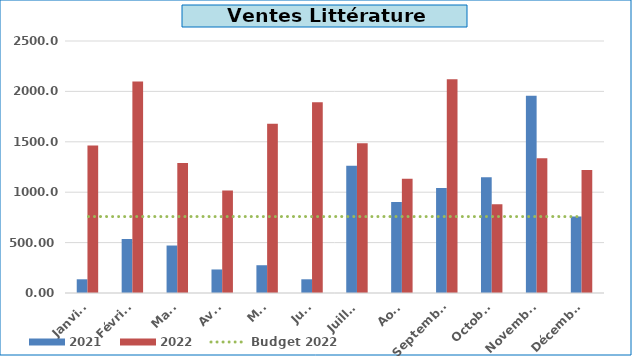
| Category | 2021 | 2022 |
|---|---|---|
| Janvier | 136 | 1463.5 |
| Février | 536 | 2097.5 |
| Mars | 471 | 1289.9 |
| Avril | 233.5 | 1018.1 |
| Mai | 275.5 | 1678.4 |
| Juin | 136 | 1892.75 |
| Juillet | 1262.1 | 1486.1 |
| Août | 903 | 1133 |
| Septembre | 1040.45 | 2119.9 |
| Octobre | 1149 | 881.1 |
| Novembre | 1956.3 | 1336.3 |
| Décembre | 759 | 1219.1 |